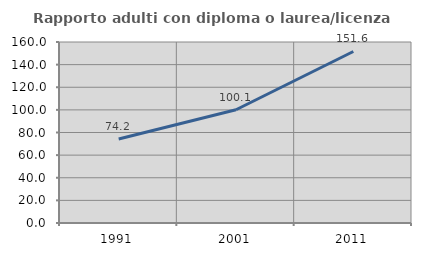
| Category | Rapporto adulti con diploma o laurea/licenza media  |
|---|---|
| 1991.0 | 74.216 |
| 2001.0 | 100.128 |
| 2011.0 | 151.617 |